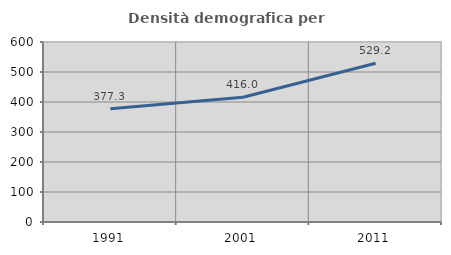
| Category | Densità demografica |
|---|---|
| 1991.0 | 377.285 |
| 2001.0 | 416.048 |
| 2011.0 | 529.154 |